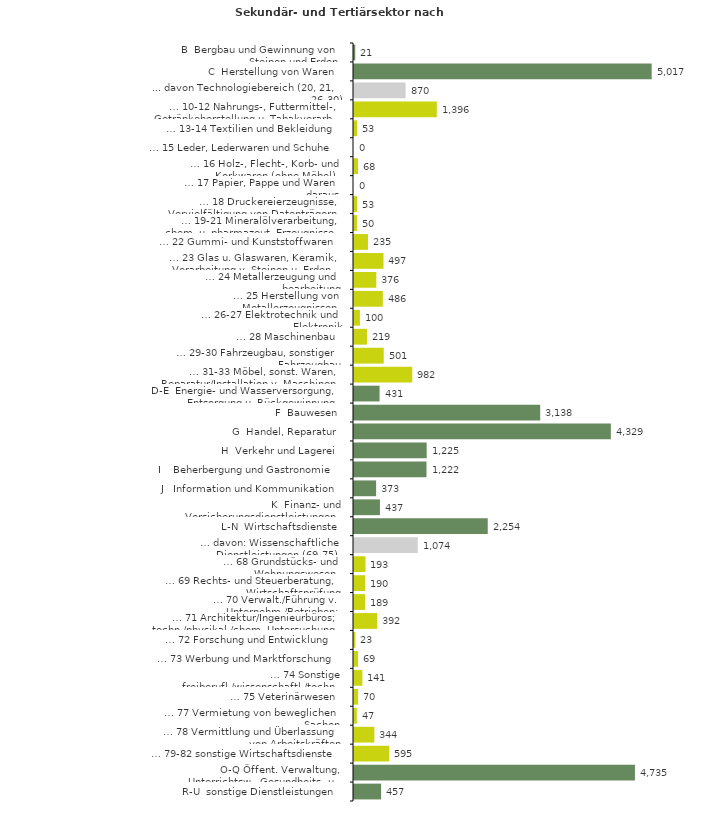
| Category | Series 0 |
|---|---|
| B  Bergbau und Gewinnung von Steinen und Erden | 21 |
| C  Herstellung von Waren | 5017 |
| ... davon Technologiebereich (20, 21, 26-30) | 870 |
| … 10-12 Nahrungs-, Futtermittel-, Getränkeherstellung u. Tabakverarb. | 1396 |
| … 13-14 Textilien und Bekleidung | 53 |
| … 15 Leder, Lederwaren und Schuhe | 0 |
| … 16 Holz-, Flecht-, Korb- und Korkwaren (ohne Möbel)  | 68 |
| … 17 Papier, Pappe und Waren daraus  | 0 |
| … 18 Druckereierzeugnisse, Vervielfältigung von Datenträgern | 53 |
| … 19-21 Mineralölverarbeitung, chem. u. pharmazeut. Erzeugnisse | 50 |
| … 22 Gummi- und Kunststoffwaren | 235 |
| … 23 Glas u. Glaswaren, Keramik, Verarbeitung v. Steinen u. Erden  | 497 |
| … 24 Metallerzeugung und -bearbeitung | 376 |
| … 25 Herstellung von Metallerzeugnissen  | 486 |
| … 26-27 Elektrotechnik und Elektronik | 100 |
| … 28 Maschinenbau | 219 |
| … 29-30 Fahrzeugbau, sonstiger Fahrzeugbau | 501 |
| … 31-33 Möbel, sonst. Waren, Reparatur/Installation v. Maschinen | 982 |
| D-E  Energie- und Wasserversorgung, Entsorgung u. Rückgewinnung | 431 |
| F  Bauwesen | 3138 |
| G  Handel, Reparatur | 4329 |
| H  Verkehr und Lagerei | 1225 |
| I    Beherbergung und Gastronomie | 1222 |
| J   Information und Kommunikation | 373 |
| K  Finanz- und Versicherungsdienstleistungen | 437 |
| L-N  Wirtschaftsdienste | 2254 |
| … davon: Wissenschaftliche Dienstleistungen (69-75) | 1074 |
| … 68 Grundstücks- und Wohnungswesen  | 193 |
| … 69 Rechts- und Steuerberatung, Wirtschaftsprüfung | 190 |
| … 70 Verwalt./Führung v. Unternehm./Betrieben; Unternehmensberat. | 189 |
| … 71 Architektur/Ingenieurbüros; techn./physikal./chem. Untersuchung | 392 |
| … 72 Forschung und Entwicklung  | 23 |
| … 73 Werbung und Marktforschung | 69 |
| … 74 Sonstige freiberufl./wissenschaftl./techn. Tätigkeiten | 141 |
| … 75 Veterinärwesen | 70 |
| … 77 Vermietung von beweglichen Sachen  | 47 |
| … 78 Vermittlung und Überlassung von Arbeitskräften | 344 |
| … 79-82 sonstige Wirtschaftsdienste | 595 |
| O-Q Öffent. Verwaltung, Unterrichtsw., Gesundheits- u. Sozialwesen | 4735 |
| R-U  sonstige Dienstleistungen | 457 |